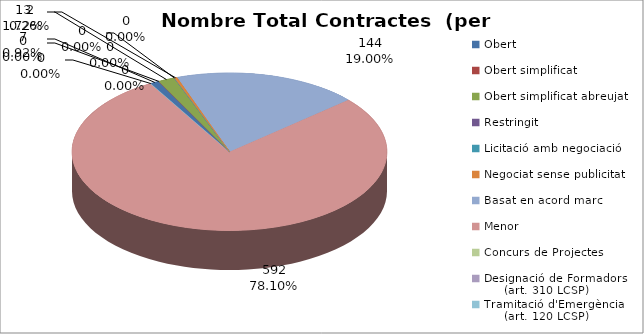
| Category | Nombre Total Contractes |
|---|---|
| Obert | 7 |
| Obert simplificat | 0 |
| Obert simplificat abreujat | 13 |
| Restringit | 0 |
| Licitació amb negociació | 0 |
| Negociat sense publicitat | 2 |
| Basat en acord marc | 144 |
| Menor | 592 |
| Concurs de Projectes | 0 |
| Designació de Formadors
     (art. 310 LCSP) | 0 |
| Tramitació d'Emergència
     (art. 120 LCSP) | 0 |